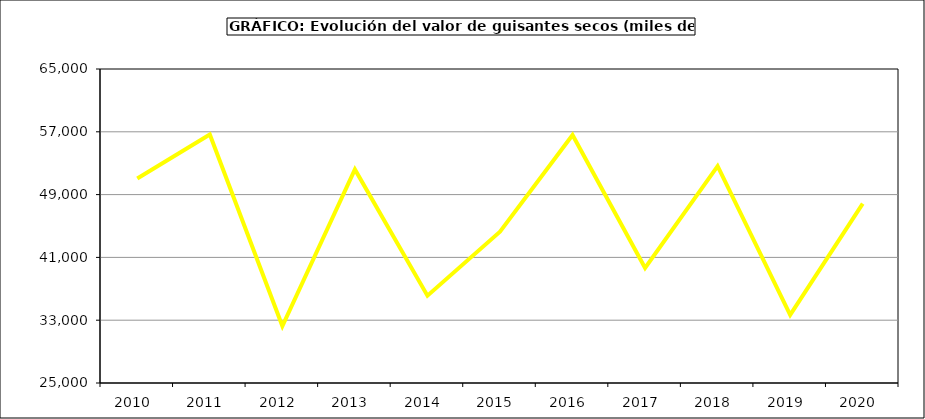
| Category | Valor |
|---|---|
| 2010.0 | 51044.567 |
| 2011.0 | 56666.277 |
| 2012.0 | 32251.03 |
| 2013.0 | 52203.832 |
| 2014.0 | 36116.283 |
| 2015.0 | 44267 |
| 2016.0 | 56599 |
| 2017.0 | 39648.556 |
| 2018.0 | 52618.427 |
| 2019.0 | 33672.184 |
| 2020.0 | 47860.594 |